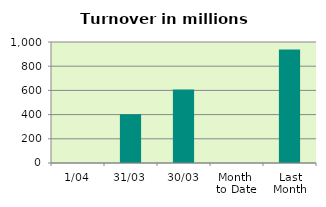
| Category | Series 0 |
|---|---|
| 1/04 | 0 |
| 31/03 | 402.392 |
| 30/03 | 607.878 |
| Month 
to Date | 0 |
| Last
Month | 937.305 |